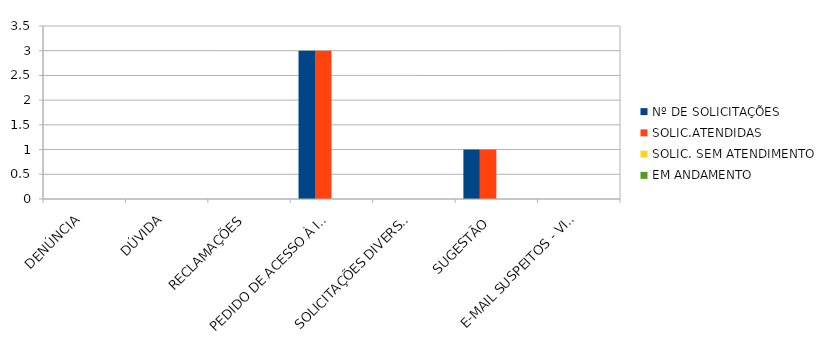
| Category | Nº DE SOLICITAÇÕES | SOLIC.ATENDIDAS | SOLIC. SEM ATENDIMENTO | EM ANDAMENTO |
|---|---|---|---|---|
| DENÚNCIA | 0 | 0 | 0 | 0 |
| DÚVIDA | 0 | 0 | 0 | 0 |
| RECLAMAÇÕES | 0 | 0 | 0 | 0 |
| PEDIDO DE ACESSO À INFORMAÇÃO | 3 | 3 | 0 | 0 |
| SOLICITAÇÕES DIVERSAS | 0 | 0 | 0 | 0 |
| SUGESTÃO  | 1 | 1 | 0 | 0 |
| E-MAIL SUSPEITOS - VIRÚS | 0 | 0 | 0 | 0 |